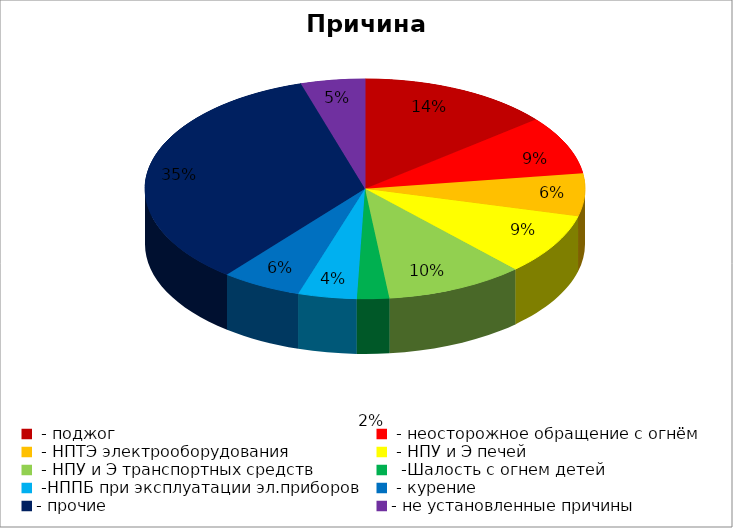
| Category | Причина пожара |
|---|---|
|  - поджог | 36 |
|  - неосторожное обращение с огнём | 22 |
|  - НПТЭ электрооборудования | 16 |
|  - НПУ и Э печей | 23 |
|  - НПУ и Э транспортных средств | 26 |
|   -Шалость с огнем детей | 6 |
|  -НППБ при эксплуатации эл.приборов | 11 |
|  - курение | 15 |
| - прочие | 88 |
| - не установленные причины | 12 |